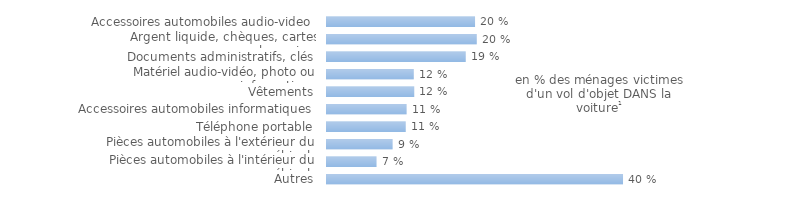
| Category | Series 0 |
|---|---|
| Autres | 0.402 |
| Pièces automobiles à l'intérieur du véhicule | 0.067 |
| Pièces automobiles à l'extérieur du véhicule | 0.089 |
| Téléphone portable | 0.107 |
| Accessoires automobiles informatiques | 0.108 |
| Vêtements | 0.118 |
| Matériel audio-vidéo, photo ou informatique | 0.118 |
| Documents administratifs, clés | 0.188 |
| Argent liquide, chèques, cartes bancaires | 0.203 |
| Accessoires automobiles audio-video | 0.201 |